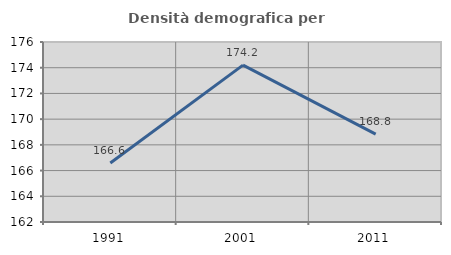
| Category | Densità demografica |
|---|---|
| 1991.0 | 166.587 |
| 2001.0 | 174.203 |
| 2011.0 | 168.83 |